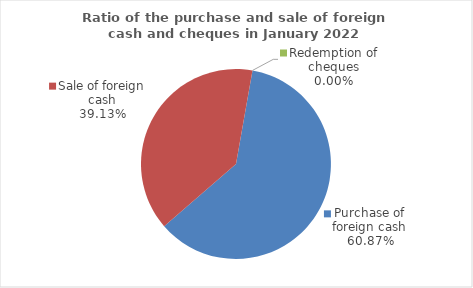
| Category | Series 0 |
|---|---|
| Purchase of foreign cash | 60.869 |
| Sale of foreign cash | 39.131 |
| Redemption of cheques | 0 |